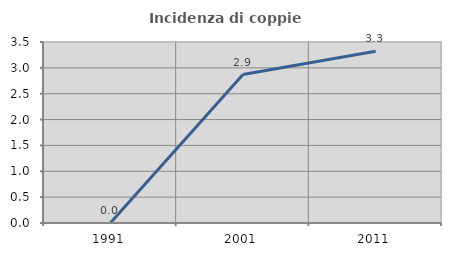
| Category | Incidenza di coppie miste |
|---|---|
| 1991.0 | 0 |
| 2001.0 | 2.87 |
| 2011.0 | 3.32 |